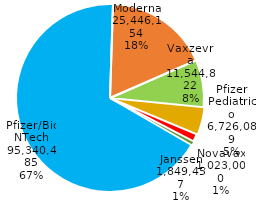
| Category | Series 0 |
|---|---|
| Pfizer/BioNTech | 95340485 |
| Moderna | 25446154 |
| Vaxzevria | 11544822 |
| Pfizer Pediatrico | 6726089 |
| Janssen | 1849457 |
| Novavax | 1023000 |